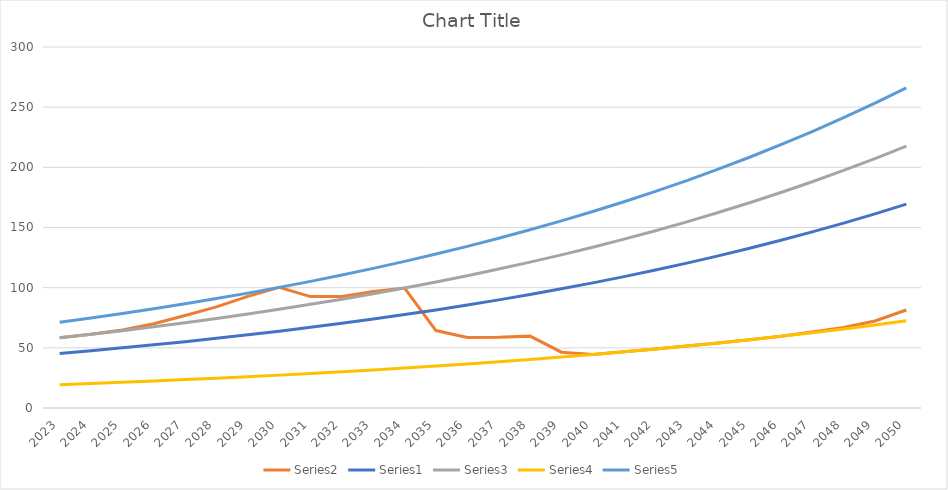
| Category | Series 1 | Series 0 | Series 2 | Series 3 | Series 4 |
|---|---|---|---|---|---|
| 2023.0 | 58.31 | 45.37 | 58.31 | 19.41 | 71.23 |
| 2024.0 | 61.21 | 47.65 | 61.21 | 20.39 | 74.79 |
| 2025.0 | 64.76 | 50.03 | 64.28 | 21.4 | 78.54 |
| 2026.0 | 69.96 | 52.53 | 67.49 | 22.47 | 82.46 |
| 2027.0 | 76.91 | 55.15 | 70.87 | 23.6 | 86.59 |
| 2028.0 | 84.01 | 57.91 | 74.41 | 24.77 | 90.92 |
| 2029.0 | 92.76 | 60.81 | 78.13 | 26.02 | 95.46 |
| 2030.0 | 100.23 | 63.85 | 82.04 | 27.32 | 100.23 |
| 2031.0 | 92.57 | 67.04 | 86.15 | 28.69 | 105.24 |
| 2032.0 | 92.63 | 70.4 | 90.45 | 30.11 | 110.5 |
| 2033.0 | 96.74 | 73.91 | 94.98 | 31.62 | 116.03 |
| 2034.0 | 99.73 | 77.61 | 99.73 | 33.2 | 121.83 |
| 2035.0 | 64.35 | 81.49 | 104.71 | 34.86 | 127.92 |
| 2036.0 | 58.58 | 85.57 | 109.95 | 36.6 | 134.32 |
| 2037.0 | 58.79 | 89.84 | 115.44 | 38.43 | 141.04 |
| 2038.0 | 59.72 | 94.33 | 121.21 | 40.35 | 148.08 |
| 2039.0 | 46.39 | 99.05 | 127.27 | 42.38 | 155.49 |
| 2040.0 | 44.49 | 104 | 133.63 | 44.49 | 163.27 |
| 2041.0 | 46.72 | 109.2 | 140.32 | 46.72 | 171.43 |
| 2042.0 | 49.05 | 114.66 | 147.34 | 49.05 | 180 |
| 2043.0 | 51.5 | 120.39 | 154.7 | 51.5 | 189 |
| 2044.0 | 54.08 | 126.42 | 162.43 | 54.08 | 198.46 |
| 2045.0 | 56.78 | 132.74 | 170.56 | 56.78 | 208.37 |
| 2046.0 | 59.62 | 139.38 | 179.09 | 59.62 | 218.8 |
| 2047.0 | 63.2 | 146.34 | 188.04 | 62.61 | 229.73 |
| 2048.0 | 66.91 | 153.66 | 197.44 | 65.74 | 241.22 |
| 2049.0 | 72.3 | 161.35 | 207.31 | 69.03 | 253.28 |
| 2050.0 | 81.47 | 169.41 | 217.68 | 72.48 | 265.95 |